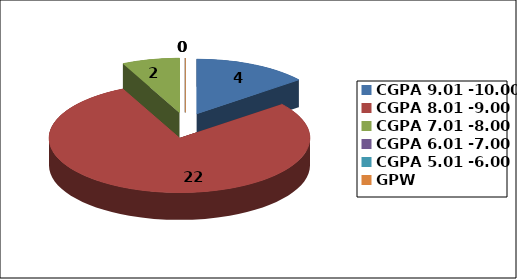
| Category | Series 0 |
|---|---|
| CGPA 9.01 -10.00 | 4 |
| CGPA 8.01 -9.00 | 22 |
| CGPA 7.01 -8.00 | 2 |
| CGPA 6.01 -7.00 | 0 |
| CGPA 5.01 -6.00 | 0 |
| GPW | 0 |